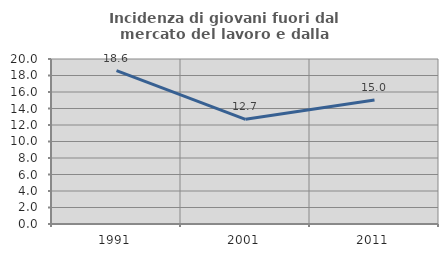
| Category | Incidenza di giovani fuori dal mercato del lavoro e dalla formazione  |
|---|---|
| 1991.0 | 18.586 |
| 2001.0 | 12.693 |
| 2011.0 | 15.032 |